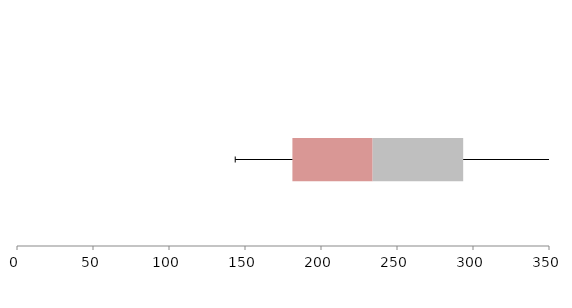
| Category | Series 1 | Series 2 | Series 3 |
|---|---|---|---|
| 0 | 181.189 | 52.782 | 59.568 |